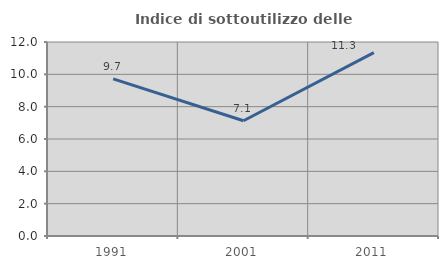
| Category | Indice di sottoutilizzo delle abitazioni  |
|---|---|
| 1991.0 | 9.717 |
| 2001.0 | 7.128 |
| 2011.0 | 11.344 |